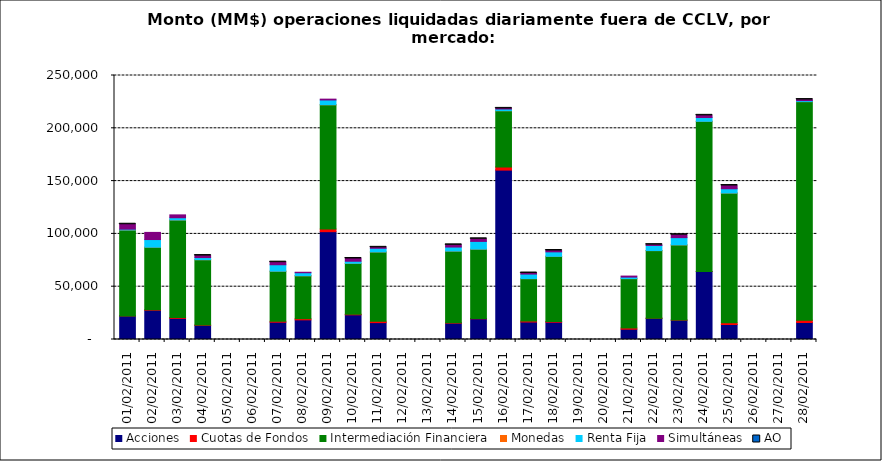
| Category | Acciones | Cuotas de Fondos | Intermediación Financiera | Monedas | Renta Fija | Simultáneas | AO |
|---|---|---|---|---|---|---|---|
| 01/02/2011 | 22290.763 | 72.931 | 81310.865 | 7.362 | 807.738 | 4642.86 | 0.793 |
| 02/02/2011 | 27728.304 | 399.197 | 59254.954 | 18.13 | 7252.21 | 6763.11 | 0 |
| 03/02/2011 | 20024.662 | 800.486 | 92349.537 | 8.406 | 2119.943 | 2711.782 | 0 |
| 04/02/2011 | 13415.958 | 330.345 | 61804.223 | 3 | 2021.263 | 1910.416 | 0.467 |
| 07/02/2011 | 16389.171 | 788.05 | 47498.831 | 4.494 | 6114.505 | 2428.63 | 0.032 |
| 08/02/2011 | 18607.841 | 1119.662 | 40613.77 | 43.38 | 2840.945 | 456.636 | 0 |
| 09/02/2011 | 102113.757 | 2518.102 | 117629.723 | 53.93 | 4509.435 | 787.634 | 0 |
| 10/02/2011 | 23372.415 | 529.335 | 48237.416 | 10.615 | 1948.857 | 2610.402 | 0.032 |
| 11/02/2011 | 15987.92 | 1257.777 | 65658.564 | 5.18 | 3487.212 | 858.503 | 0.159 |
| 14/02/2011 | 15470.826 | 388.889 | 67872.996 | 0.46 | 3816.84 | 2063.662 | 0.829 |
| 15/02/2011 | 19622.298 | 318.879 | 65633.246 | 9.66 | 7311.063 | 2430.913 | 0.241 |
| 16/02/2011 | 160402.986 | 2989.371 | 53241.078 | 12.285 | 1633.112 | 570.147 | 0.073 |
| 17/02/2011 | 16565.733 | 933.528 | 40125.842 | 11.25 | 4326.94 | 968.083 | 0.036 |
| 18/02/2011 | 16385.43 | 654.796 | 61706.984 | 2.67 | 4246.761 | 1255.072 | 0.133 |
| 21/02/2011 | 9752.27 | 1175.679 | 46715.224 | 3.15 | 1457.25 | 949.513 | 0 |
| 22/02/2011 | 20001.239 | 220.662 | 63961.489 | 11.298 | 4851.478 | 757.376 | 0.188 |
| 23/02/2011 | 18307.709 | 87.314 | 71205.12 | 9.953 | 6848.942 | 2735.989 | 1.871 |
| 24/02/2011 | 64367.86 | 47.664 | 142188.123 | 5.46 | 3581.33 | 2050.561 | 0.425 |
| 25/02/2011 | 14206.227 | 1564.876 | 122916.182 | 3.623 | 4066.755 | 3016.97 | 0.052 |
| 28/02/2011 | 16086.908 | 2194.479 | 206984.386 | 0.913 | 943.257 | 983.204 | 0.025 |